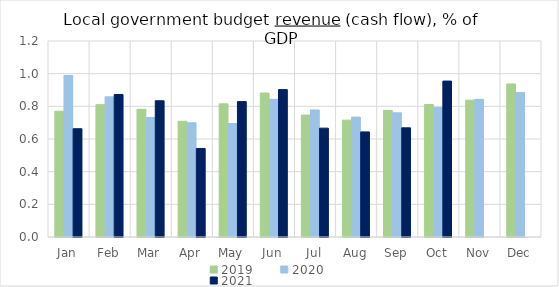
| Category | 2019 | 2020 | 2021 |
|---|---|---|---|
| Jan | 0.77 | 0.989 | 0.663 |
| Feb | 0.81 | 0.858 | 0.872 |
| Mar | 0.782 | 0.732 | 0.834 |
| Apr | 0.709 | 0.699 | 0.542 |
| May | 0.815 | 0.695 | 0.829 |
| Jun | 0.881 | 0.843 | 0.902 |
| Jul | 0.746 | 0.778 | 0.666 |
| Aug | 0.715 | 0.734 | 0.644 |
| Sep | 0.775 | 0.76 | 0.668 |
| Oct | 0.811 | 0.792 | 0.955 |
| Nov | 0.837 | 0.843 | 0 |
| Dec | 0.937 | 0.885 | 0 |